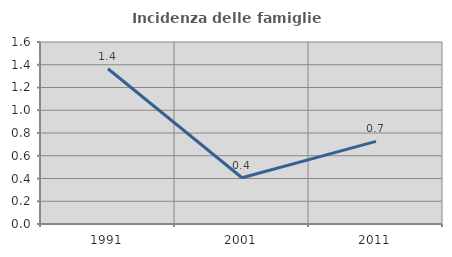
| Category | Incidenza delle famiglie numerose |
|---|---|
| 1991.0 | 1.365 |
| 2001.0 | 0.407 |
| 2011.0 | 0.727 |